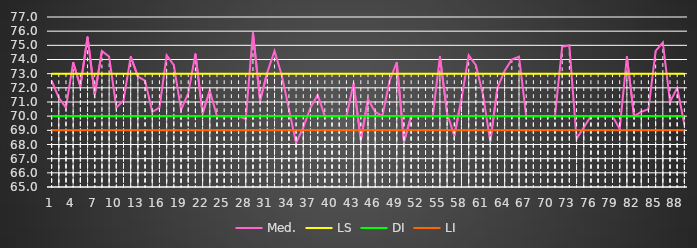
| Category | Med. | LS | DI | LI |
|---|---|---|---|---|
| 0 | 72.5 | 73 | 70 | 69 |
| 1 | 71.3 | 73 | 70 | 69 |
| 2 | 70.6 | 73 | 70 | 69 |
| 3 | 73.8 | 73 | 70 | 69 |
| 4 | 72.1 | 73 | 70 | 69 |
| 5 | 75.6 | 73 | 70 | 69 |
| 6 | 71.5 | 73 | 70 | 69 |
| 7 | 74.6 | 73 | 70 | 69 |
| 8 | 74.2 | 73 | 70 | 69 |
| 9 | 70.6 | 73 | 70 | 69 |
| 10 | 71.1 | 73 | 70 | 69 |
| 11 | 74.2 | 73 | 70 | 69 |
| 12 | 72.8 | 73 | 70 | 69 |
| 13 | 72.5 | 73 | 70 | 69 |
| 14 | 70.3 | 73 | 70 | 69 |
| 15 | 70.6 | 73 | 70 | 69 |
| 16 | 74.3 | 73 | 70 | 69 |
| 17 | 73.6 | 73 | 70 | 69 |
| 18 | 70.45 | 73 | 70 | 69 |
| 19 | 71.6 | 73 | 70 | 69 |
| 20 | 74.4 | 73 | 70 | 69 |
| 21 | 70.2 | 73 | 70 | 69 |
| 22 | 71.8 | 73 | 70 | 69 |
| 23 | 70 | 73 | 70 | 69 |
| 24 | 70 | 73 | 70 | 69 |
| 25 | 70 | 73 | 70 | 69 |
| 26 | 70 | 73 | 70 | 69 |
| 27 | 69.8 | 73 | 70 | 69 |
| 28 | 75.9 | 73 | 70 | 69 |
| 29 | 71.1 | 73 | 70 | 69 |
| 30 | 73.1 | 73 | 70 | 69 |
| 31 | 74.6 | 73 | 70 | 69 |
| 32 | 72.9 | 73 | 70 | 69 |
| 33 | 70.5 | 73 | 70 | 69 |
| 34 | 68.1 | 73 | 70 | 69 |
| 35 | 69.2 | 73 | 70 | 69 |
| 36 | 70.6 | 73 | 70 | 69 |
| 37 | 71.5 | 73 | 70 | 69 |
| 38 | 70 | 73 | 70 | 69 |
| 39 | 70 | 73 | 70 | 69 |
| 40 | 70 | 73 | 70 | 69 |
| 41 | 70 | 73 | 70 | 69 |
| 42 | 72.3 | 73 | 70 | 69 |
| 43 | 68.3 | 73 | 70 | 69 |
| 44 | 71.2 | 73 | 70 | 69 |
| 45 | 70.3 | 73 | 70 | 69 |
| 46 | 70 | 73 | 70 | 69 |
| 47 | 72.5 | 73 | 70 | 69 |
| 48 | 73.8 | 73 | 70 | 69 |
| 49 | 68.2 | 73 | 70 | 69 |
| 50 | 70 | 73 | 70 | 69 |
| 51 | 70 | 73 | 70 | 69 |
| 52 | 70 | 73 | 70 | 69 |
| 53 | 70 | 73 | 70 | 69 |
| 54 | 74.2 | 73 | 70 | 69 |
| 55 | 70.2 | 73 | 70 | 69 |
| 56 | 68.6 | 73 | 70 | 69 |
| 57 | 71.2 | 73 | 70 | 69 |
| 58 | 74.3 | 73 | 70 | 69 |
| 59 | 73.6 | 73 | 70 | 69 |
| 60 | 71.5 | 73 | 70 | 69 |
| 61 | 68.2 | 73 | 70 | 69 |
| 62 | 72 | 73 | 70 | 69 |
| 63 | 73.2 | 73 | 70 | 69 |
| 64 | 74 | 73 | 70 | 69 |
| 65 | 74.2 | 73 | 70 | 69 |
| 66 | 70 | 73 | 70 | 69 |
| 67 | 70 | 73 | 70 | 69 |
| 68 | 70 | 73 | 70 | 69 |
| 69 | 70 | 73 | 70 | 69 |
| 70 | 70 | 73 | 70 | 69 |
| 71 | 74.9 | 73 | 70 | 69 |
| 72 | 75 | 73 | 70 | 69 |
| 73 | 68.4 | 73 | 70 | 69 |
| 74 | 69.2 | 73 | 70 | 69 |
| 75 | 70 | 73 | 70 | 69 |
| 76 | 70 | 73 | 70 | 69 |
| 77 | 70 | 73 | 70 | 69 |
| 78 | 70 | 73 | 70 | 69 |
| 79 | 69.1 | 73 | 70 | 69 |
| 80 | 74.2 | 73 | 70 | 69 |
| 81 | 70 | 73 | 70 | 69 |
| 82 | 70.3 | 73 | 70 | 69 |
| 83 | 70.5 | 73 | 70 | 69 |
| 84 | 74.6 | 73 | 70 | 69 |
| 85 | 75.2 | 73 | 70 | 69 |
| 86 | 71 | 73 | 70 | 69 |
| 87 | 72 | 73 | 70 | 69 |
| 88 | 69.4 | 73 | 70 | 69 |